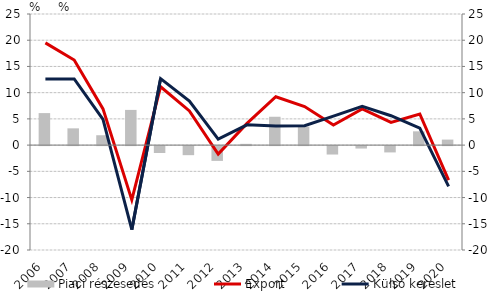
| Category | Piaci részesedés |
|---|---|
| 2006.0 | 6.105 |
| 2007.0 | 3.196 |
| 2008.0 | 1.885 |
| 2009.0 | 6.713 |
| 2010.0 | -1.308 |
| 2011.0 | -1.728 |
| 2012.0 | -2.817 |
| 2013.0 | 0.241 |
| 2014.0 | 5.407 |
| 2015.0 | 3.529 |
| 2016.0 | -1.605 |
| 2017.0 | -0.463 |
| 2018.0 | -1.203 |
| 2019.0 | 2.629 |
| 2020.0 | 1.052 |